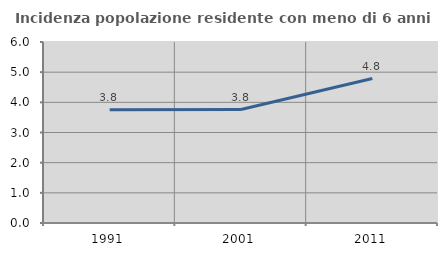
| Category | Incidenza popolazione residente con meno di 6 anni |
|---|---|
| 1991.0 | 3.758 |
| 2001.0 | 3.762 |
| 2011.0 | 4.79 |